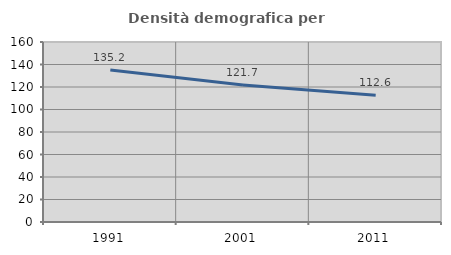
| Category | Densità demografica |
|---|---|
| 1991.0 | 135.161 |
| 2001.0 | 121.736 |
| 2011.0 | 112.57 |